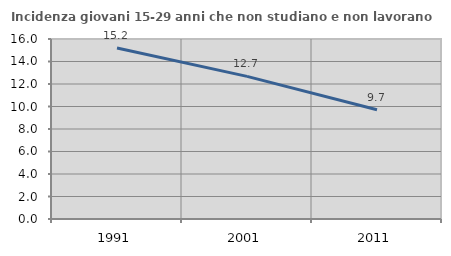
| Category | Incidenza giovani 15-29 anni che non studiano e non lavorano  |
|---|---|
| 1991.0 | 15.2 |
| 2001.0 | 12.681 |
| 2011.0 | 9.715 |